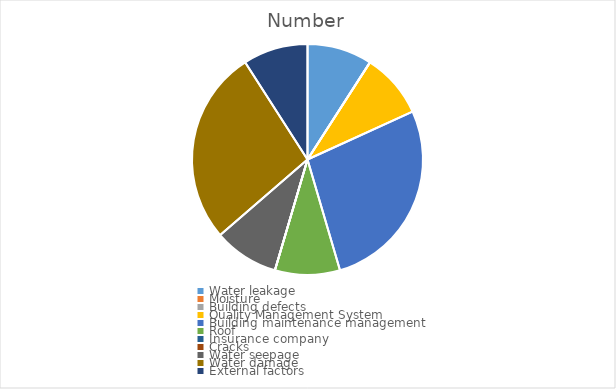
| Category | Number |
|---|---|
| Water leakage | 1 |
| Moisture | 0 |
| Building defects | 0 |
| Quality Management System | 1 |
| Building maintenance management | 3 |
| Roof | 1 |
| Insurance company | 0 |
| Cracks | 0 |
| Water seepage | 1 |
| Water damage | 3 |
| External factors | 1 |